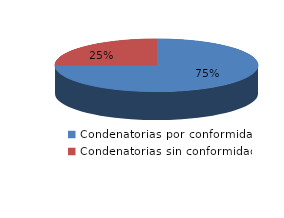
| Category | Series 0 |
|---|---|
| 0 | 733 |
| 1 | 244 |